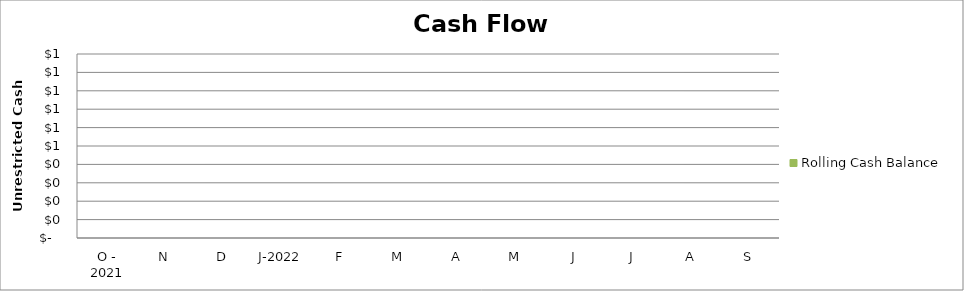
| Category | Rolling Cash Balance |
|---|---|
| O - 2021 | 0 |
| N | 0 |
| D | 0 |
| J-2022 | 0 |
| F | 0 |
| M | 0 |
| A | 0 |
| M | 0 |
| J | 0 |
| J | 0 |
| A | 0 |
| S | 0 |